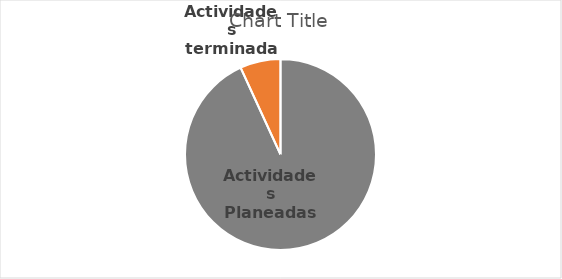
| Category | Series 0 |
|---|---|
| Actividades Planeadas | 68 |
| Actividades terminadas | 5 |